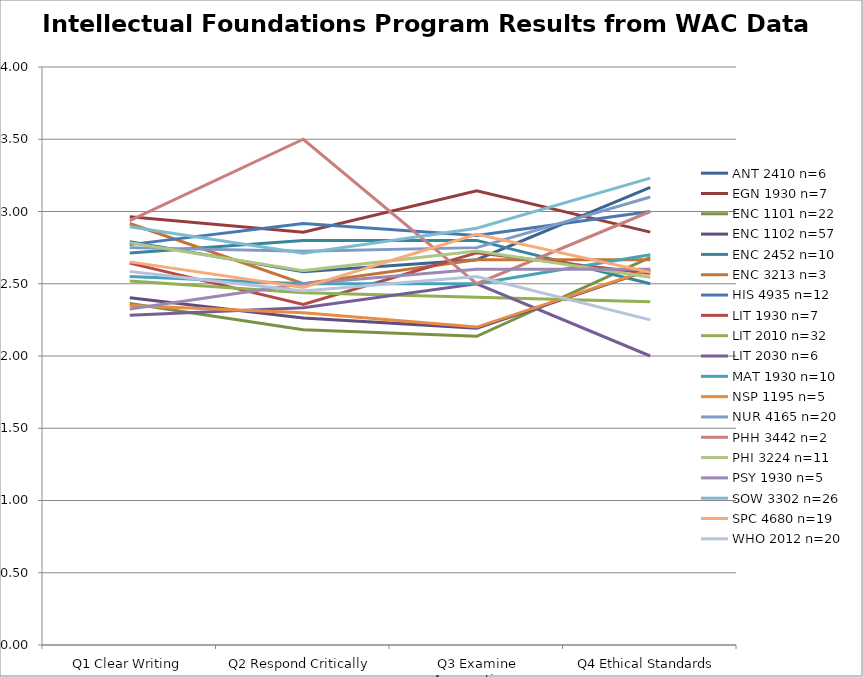
| Category | ANT 2410 n=6 | EGN 1930 n=7 | ENC 1101 n=22 | ENC 1102 n=57 | ENC 2452 n=10 | ENC 3213 n=3 | HIS 4935 n=12 | LIT 1930 n=7 | LIT 2010 n=32 | LIT 2030 n=6 | MAT 1930 n=10 | NSP 1195 n=5 | NUR 4165 n=20 | PHH 3442 n=2 | PHI 3224 n=11 | PSY 1930 n=5 | SOW 3302 n=26 | SPC 4680 n=19 | WHO 2012 n=20 |
|---|---|---|---|---|---|---|---|---|---|---|---|---|---|---|---|---|---|---|---|
| Q1 Clear Writing | 2.792 | 2.964 | 2.364 | 2.402 | 2.712 | 2.917 | 2.771 | 2.643 | 2.52 | 2.281 | 2.55 | 2.35 | 2.75 | 2.938 | 2.784 | 2.325 | 2.894 | 2.651 | 2.584 |
| Q2 Respond Critically | 2.583 | 2.857 | 2.182 | 2.263 | 2.8 | 2.5 | 2.917 | 2.357 | 2.438 | 2.333 | 2.5 | 2.3 | 2.725 | 3.5 | 2.591 | 2.5 | 2.712 | 2.474 | 2.45 |
|  Q3 Examine Assumptions | 2.667 | 3.143 | 2.136 | 2.193 | 2.8 | 2.667 | 2.833 | 2.714 | 2.406 | 2.5 | 2.5 | 2.2 | 2.75 | 2.5 | 2.727 | 2.6 | 2.885 | 2.842 | 2.55 |
| Q4 Ethical Standards | 3.167 | 2.857 | 2.682 | 2.596 | 2.5 | 2.667 | 3 | 2.571 | 2.375 | 2 | 2.7 | 2.6 | 3.1 | 3 | 2.545 | 2.6 | 3.231 | 2.579 | 2.25 |